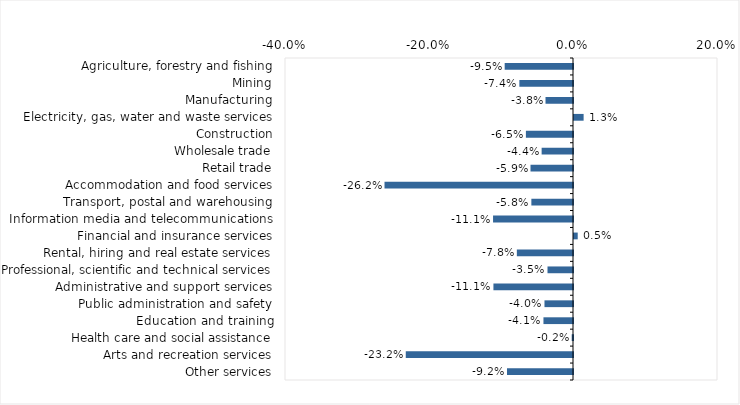
| Category | This week |
|---|---|
| Agriculture, forestry and fishing | -0.095 |
| Mining | -0.074 |
| Manufacturing | -0.038 |
| Electricity, gas, water and waste services | 0.013 |
| Construction | -0.065 |
| Wholesale trade | -0.044 |
| Retail trade | -0.059 |
| Accommodation and food services | -0.262 |
| Transport, postal and warehousing | -0.058 |
| Information media and telecommunications | -0.111 |
| Financial and insurance services | 0.005 |
| Rental, hiring and real estate services | -0.078 |
| Professional, scientific and technical services | -0.035 |
| Administrative and support services | -0.111 |
| Public administration and safety | -0.04 |
| Education and training | -0.041 |
| Health care and social assistance | -0.002 |
| Arts and recreation services | -0.232 |
| Other services | -0.092 |